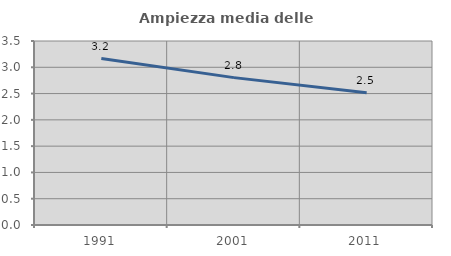
| Category | Ampiezza media delle famiglie |
|---|---|
| 1991.0 | 3.167 |
| 2001.0 | 2.803 |
| 2011.0 | 2.514 |